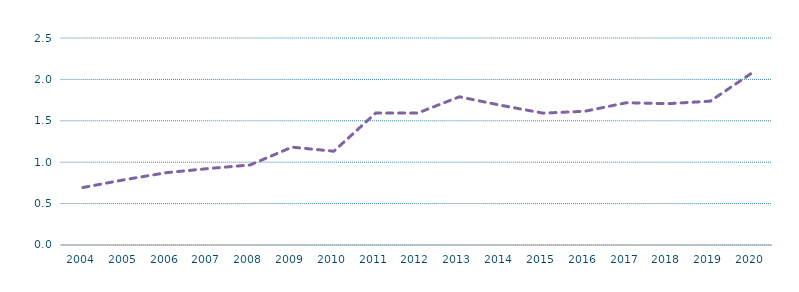
| Category | Generación resto renovables/Generacion total (%) |
|---|---|
| 2004.0 | 0.694 |
| 2005.0 | 0.789 |
| 2006.0 | 0.874 |
| 2007.0 | 0.923 |
| 2008.0 | 0.967 |
| 2009.0 | 1.182 |
| 2010.0 | 1.133 |
| 2011.0 | 1.593 |
| 2012.0 | 1.593 |
| 2013.0 | 1.789 |
| 2014.0 | 1.687 |
| 2015.0 | 1.592 |
| 2016.0 | 1.615 |
| 2017.0 | 1.718 |
| 2018.0 | 1.707 |
| 2019.0 | 1.737 |
| 2020.0 | 2.079 |